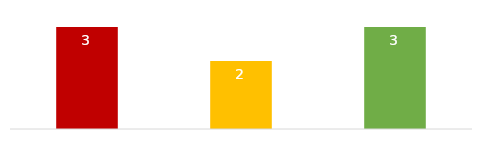
| Category | Series 0 | Series 1 |
|---|---|---|
| Experied | 3 | 0 |
| Neer to Expire | 2 | 0 |
| Valid | 3 | 0 |